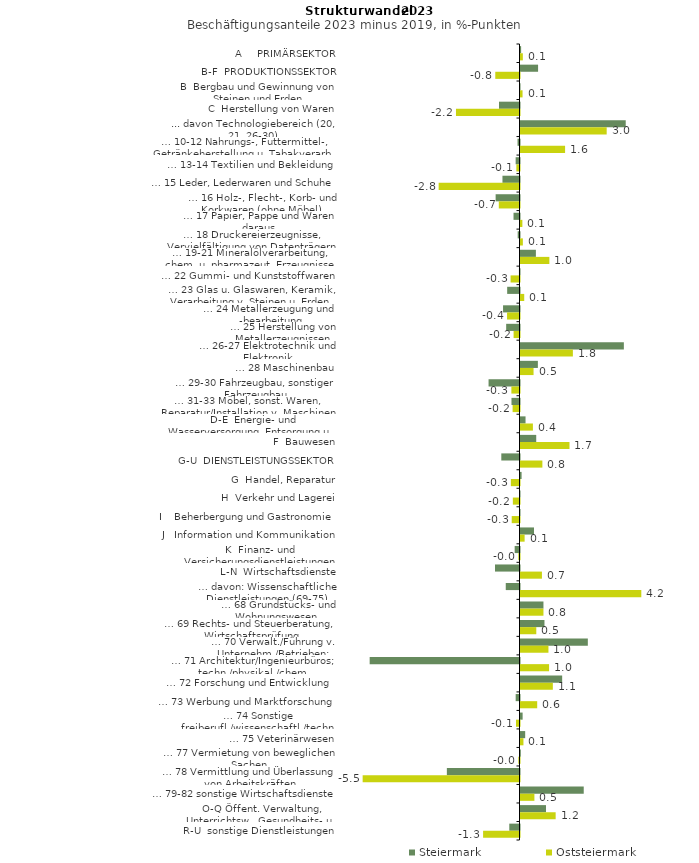
| Category | Steiermark | Oststeiermark |
|---|---|---|
| A     PRIMÄRSEKTOR | 0.022 | 0.081 |
| B-F  PRODUKTIONSSEKTOR | 0.612 | -0.842 |
| B  Bergbau und Gewinnung von Steinen und Erden | -0.009 | 0.071 |
| C  Herstellung von Waren | -0.714 | -2.209 |
| ... davon Technologiebereich (20, 21, 26-30) | 3.66 | 2.998 |
| … 10-12 Nahrungs-, Futtermittel-, Getränkeherstellung u. Tabakverarb. | -0.068 | 1.551 |
| … 13-14 Textilien und Bekleidung | -0.134 | -0.11 |
| … 15 Leder, Lederwaren und Schuhe | -0.593 | -2.812 |
| … 16 Holz-, Flecht-, Korb- und Korkwaren (ohne Möbel)  | -0.83 | -0.72 |
| … 17 Papier, Pappe und Waren daraus  | -0.208 | 0.065 |
| … 18 Druckereierzeugnisse, Vervielfältigung von Datenträgern | -0.063 | 0.082 |
| … 19-21 Mineralölverarbeitung, chem. u. pharmazeut. Erzeugnisse | 0.535 | 1.004 |
| … 22 Gummi- und Kunststoffwaren | -0.02 | -0.31 |
| … 23 Glas u. Glaswaren, Keramik, Verarbeitung v. Steinen u. Erden  | -0.429 | 0.13 |
| … 24 Metallerzeugung und -bearbeitung | -0.572 | -0.433 |
| … 25 Herstellung von Metallerzeugnissen  | -0.464 | -0.205 |
| … 26-27 Elektrotechnik und Elektronik | 3.595 | 1.822 |
| … 28 Maschinenbau | 0.604 | 0.454 |
| … 29-30 Fahrzeugbau, sonstiger Fahrzeugbau | -1.076 | -0.282 |
| … 31-33 Möbel, sonst. Waren, Reparatur/Installation v. Maschinen | -0.279 | -0.24 |
| D-E  Energie- und Wasserversorgung, Entsorgung u. Rückgewinnung | 0.175 | 0.431 |
| F  Bauwesen | 0.547 | 1.704 |
| G-U  DIENSTLEISTUNGSSEKTOR | -0.633 | 0.761 |
| G  Handel, Reparatur | 0.038 | -0.301 |
| H  Verkehr und Lagerei | -0.011 | -0.231 |
| I    Beherbergung und Gastronomie | -0.007 | -0.271 |
| J   Information und Kommunikation | 0.471 | 0.143 |
| K  Finanz- und Versicherungsdienstleistungen | -0.168 | -0.04 |
| L-N  Wirtschaftsdienste | -0.853 | 0.746 |
| … davon: Wissenschaftliche Dienstleistungen (69-75) | -0.478 | 4.202 |
| … 68 Grundstücks- und Wohnungswesen  | 0.798 | 0.798 |
| … 69 Rechts- und Steuerberatung, Wirtschaftsprüfung | 0.834 | 0.549 |
| … 70 Verwalt./Führung v. Unternehm./Betrieben; Unternehmensberat. | 2.342 | 0.972 |
| … 71 Architektur/Ingenieurbüros; techn./physikal./chem. Untersuchung | -5.212 | 0.994 |
| … 72 Forschung und Entwicklung  | 1.449 | 1.125 |
| … 73 Werbung und Marktforschung | -0.133 | 0.581 |
| … 74 Sonstige freiberufl./wissenschaftl./techn. Tätigkeiten | 0.074 | -0.122 |
| … 75 Veterinärwesen | 0.163 | 0.102 |
| … 77 Vermietung von beweglichen Sachen  | 0.011 | -0.04 |
| … 78 Vermittlung und Überlassung von Arbeitskräften | -2.527 | -5.455 |
| … 79-82 sonstige Wirtschaftsdienste | 2.199 | 0.484 |
| O-Q Öffent. Verwaltung, Unterrichtsw., Gesundheits- u. Sozialwesen | 0.886 | 1.223 |
| R-U  sonstige Dienstleistungen | -0.355 | -1.266 |